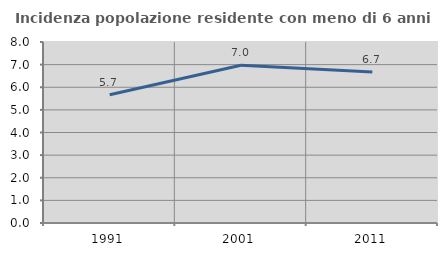
| Category | Incidenza popolazione residente con meno di 6 anni |
|---|---|
| 1991.0 | 5.669 |
| 2001.0 | 6.973 |
| 2011.0 | 6.674 |